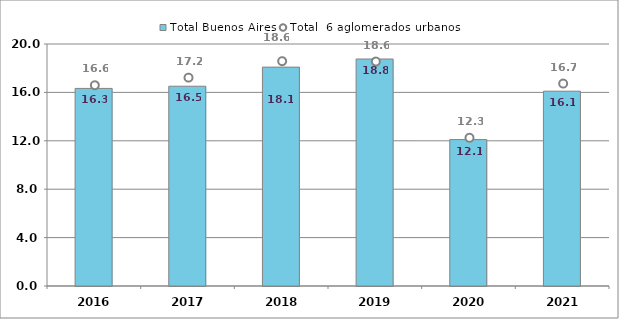
| Category | Total Buenos Aires |
|---|---|
| 2016.0 | 16.33 |
| 2017.0 | 16.51 |
| 2018.0 | 18.09 |
| 2019.0 | 18.76 |
| 2020.0 | 12.1 |
| 2021.0 | 16.1 |